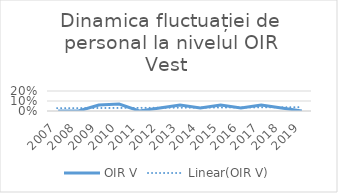
| Category | OIR V |
|---|---|
| 2007.0 | 0 |
| 2008.0 | 0 |
| 2009.0 | 0.06 |
| 2010.0 | 0.07 |
| 2011.0 | 0 |
| 2012.0 | 0.03 |
| 2013.0 | 0.06 |
| 2014.0 | 0.03 |
| 2015.0 | 0.06 |
| 2016.0 | 0.03 |
| 2017.0 | 0.06 |
| 2018.0 | 0.03 |
| 2019.0 | 0 |